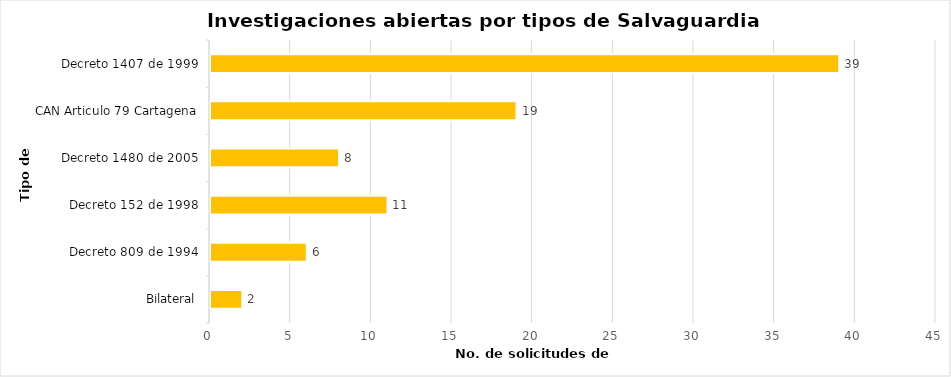
| Category | Series 0 |
|---|---|
| Bilateral | 2 |
| Decreto 809 de 1994 | 6 |
| Decreto 152 de 1998 | 11 |
| Decreto 1480 de 2005 | 8 |
| CAN Articulo 79 Cartagena | 19 |
| Decreto 1407 de 1999 | 39 |